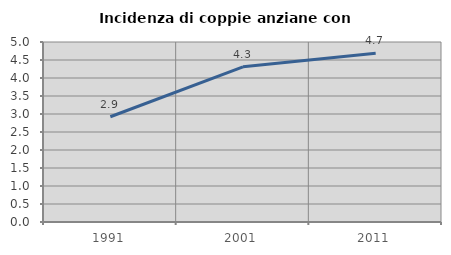
| Category | Incidenza di coppie anziane con figli |
|---|---|
| 1991.0 | 2.923 |
| 2001.0 | 4.31 |
| 2011.0 | 4.689 |